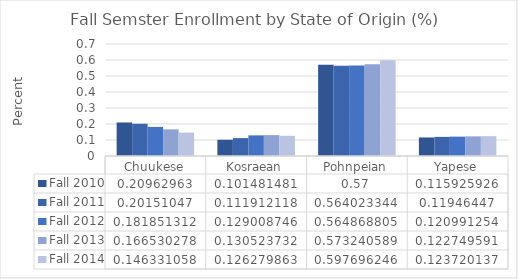
| Category | Fall 2010 | Fall 2011 | Fall 2012 | Fall 2013 | Fall 2014 |
|---|---|---|---|---|---|
| Chuukese | 0.21 | 0.202 | 0.182 | 0.167 | 0.146 |
| Kosraean | 0.101 | 0.112 | 0.129 | 0.131 | 0.126 |
| Pohnpeian | 0.57 | 0.564 | 0.565 | 0.573 | 0.598 |
| Yapese | 0.116 | 0.119 | 0.121 | 0.123 | 0.124 |